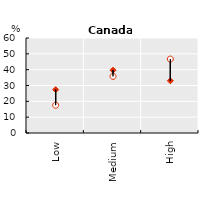
| Category | Series 0 | Series 1 | Series 2 | Series 3 |
|---|---|---|---|---|
| Low | 27.377 | 17.555 |  |  |
| Medium | 39.652 | 35.768 |  |  |
| High | 32.97 | 46.678 |  |  |